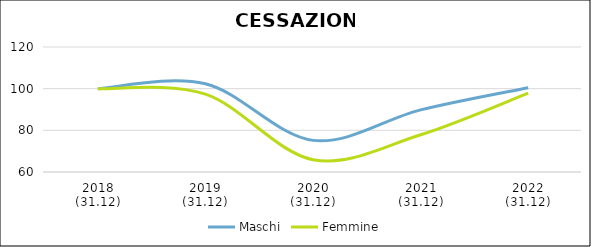
| Category | Maschi | Femmine |
|---|---|---|
| 2018
(31.12) | 100 | 100 |
| 2019
(31.12) | 102.358 | 97.4 |
| 2020
(31.12) | 75.176 | 65.896 |
| 2021
(31.12) | 89.809 | 77.869 |
| 2022
(31.12) | 100.465 | 97.866 |